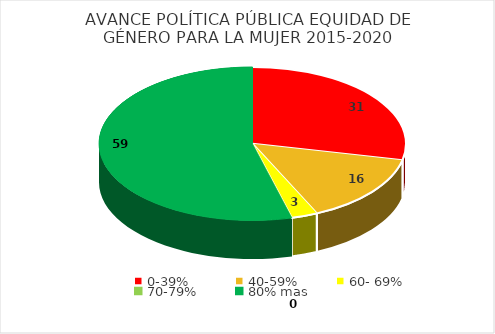
| Category | CANTIDAD |
|---|---|
| 0-39% | 31 |
| 40-59% | 16 |
| 60- 69% | 3 |
| 70-79% | 0 |
| 80% mas | 59 |